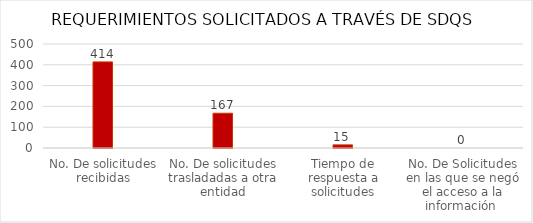
| Category | Series 0 |
|---|---|
| No. De solicitudes recibidas | 414 |
| No. De solicitudes trasladadas a otra entidad | 167 |
| Tiempo de respuesta a solicitudes | 15 |
| No. De Solicitudes en las que se negó el acceso a la información  | 0 |